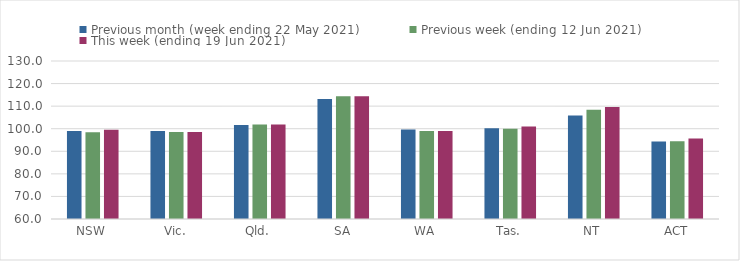
| Category | Previous month (week ending 22 May 2021) | Previous week (ending 12 Jun 2021) | This week (ending 19 Jun 2021) |
|---|---|---|---|
| NSW | 98.99 | 98.48 | 99.52 |
| Vic. | 99.04 | 98.53 | 98.53 |
| Qld. | 101.68 | 101.92 | 101.92 |
| SA | 113.13 | 114.35 | 114.35 |
| WA | 99.6 | 99.02 | 99.02 |
| Tas. | 100.17 | 99.93 | 101.02 |
| NT | 105.88 | 108.45 | 109.58 |
| ACT | 94.29 | 94.4 | 95.62 |